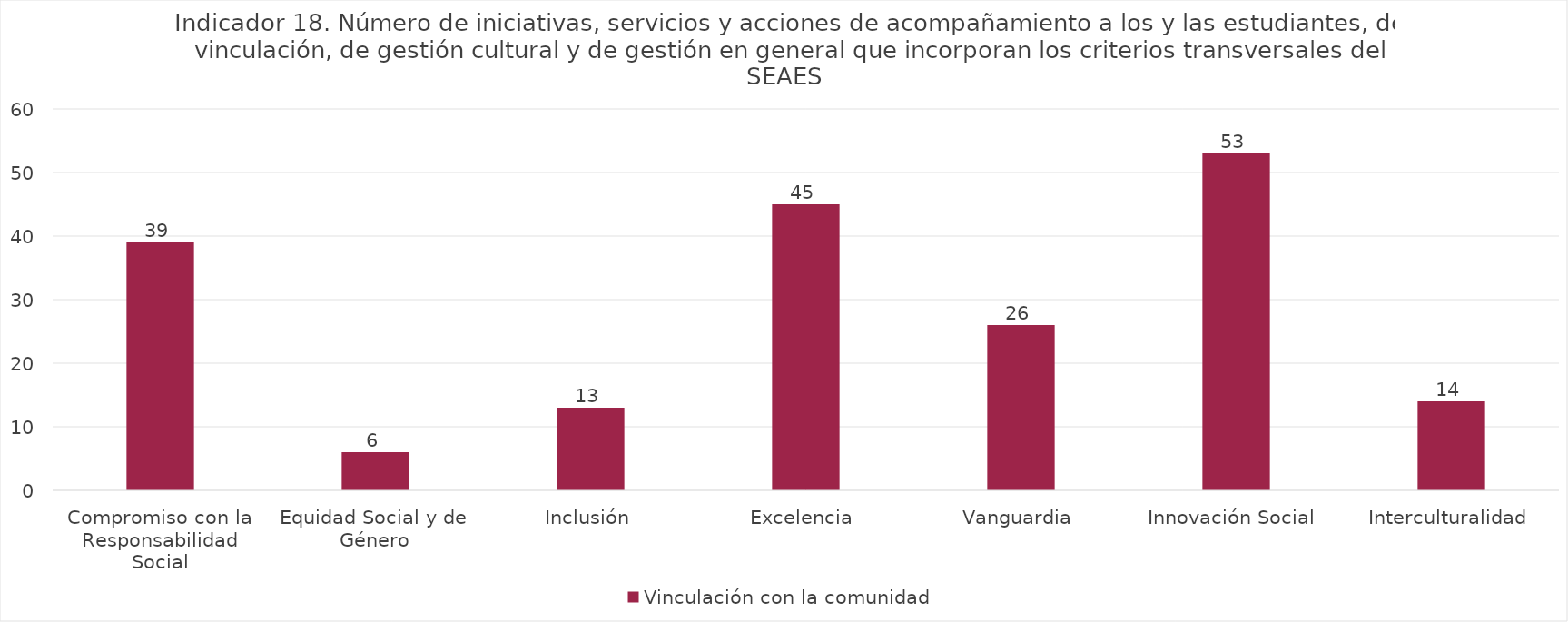
| Category | Vinculación con la comunidad |
|---|---|
| Compromiso con la Responsabilidad Social | 39 |
| Equidad Social y de Género | 6 |
| Inclusión | 13 |
| Excelencia | 45 |
| Vanguardia | 26 |
| Innovación Social | 53 |
| Interculturalidad | 14 |